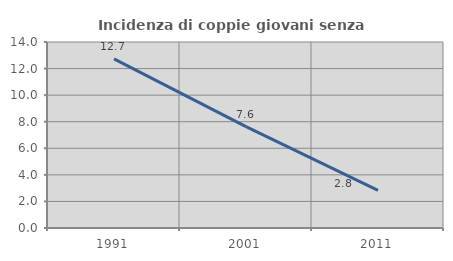
| Category | Incidenza di coppie giovani senza figli |
|---|---|
| 1991.0 | 12.727 |
| 2001.0 | 7.627 |
| 2011.0 | 2.83 |